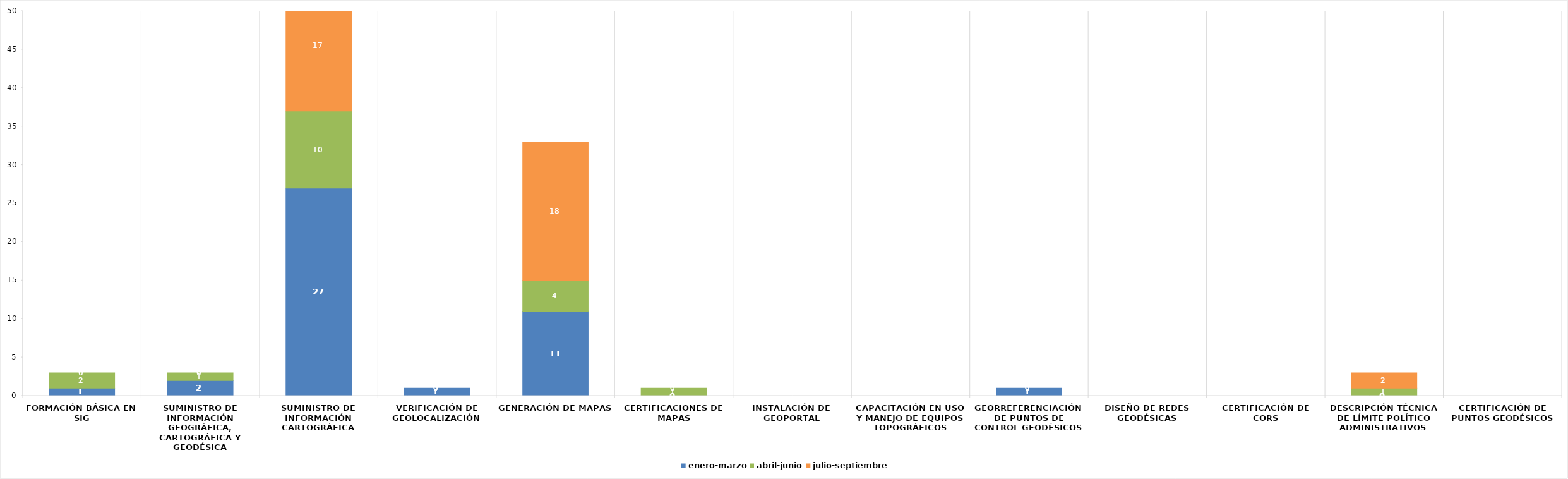
| Category | enero-marzo | abril-junio | julio-septiembre |
|---|---|---|---|
| Formación básica en SIG | 1 | 2 | 0 |
| Suministro de información geográfica, cartográfica y geodésica | 2 | 1 | 0 |
| Suministro de información cartográfica | 27 | 10 | 17 |
| Verificación de geolocalización | 1 | 0 | 0 |
| Generación de mapas | 11 | 4 | 18 |
| Certificaciones de mapas | 0 | 1 | 0 |
| Instalación de Geoportal | 0 | 0 | 0 |
| Capacitación en uso y manejo de equipos topográficos | 0 | 0 | 0 |
| Georreferenciación de puntos de control geodésicos | 1 | 0 | 0 |
| Diseño de Redes Geodésicas | 0 | 0 | 0 |
| Certificación de CORS | 0 | 0 | 0 |
| Descripción técnica de límite político administrativos | 0 | 1 | 2 |
| Certificación de puntos geodésicos | 0 | 0 | 0 |